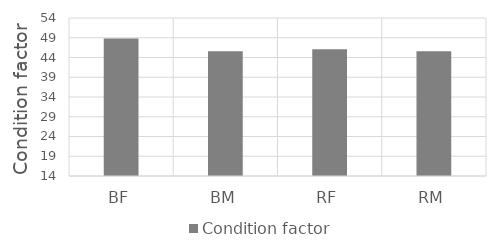
| Category | Condition factor |
|---|---|
| BF | 48.8 |
| BM | 45.6 |
| RF | 46.1 |
| RM | 45.6 |